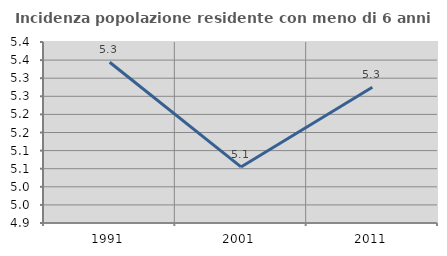
| Category | Incidenza popolazione residente con meno di 6 anni |
|---|---|
| 1991.0 | 5.344 |
| 2001.0 | 5.055 |
| 2011.0 | 5.275 |